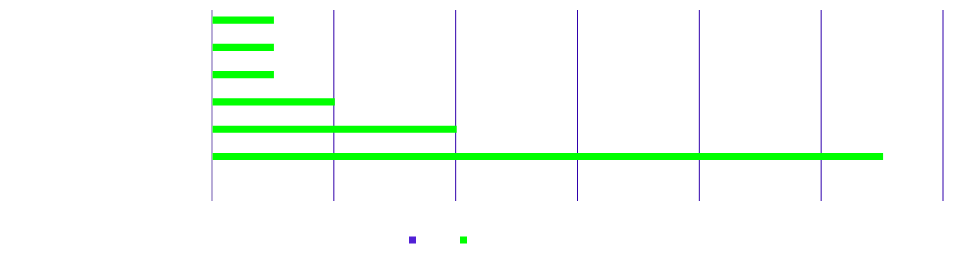
| Category | Real | Mi objetivo |
|---|---|---|
| Categoría | 0 | 0 |
| Acciones de Estados Unidos | 0 | 0.55 |
| Acciones internacionales | 0 | 0.2 |
| Bonos | 0 | 0.1 |
| Efectivo | 0 | 0.05 |
| Inmuebles | 0 | 0.05 |
| Productos | 0 | 0.05 |